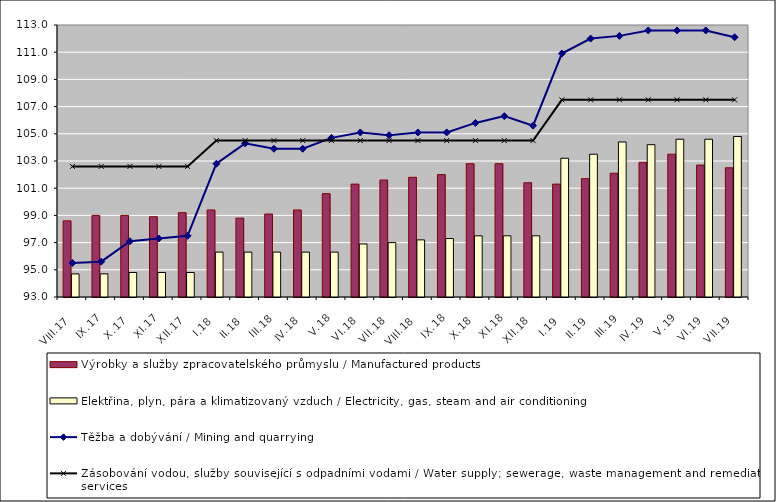
| Category | Výrobky a služby zpracovatelského průmyslu / Manufactured products | Elektřina, plyn, pára a klimatizovaný vzduch / Electricity, gas, steam and air conditioning |
|---|---|---|
| VIII.17 | 98.6 | 94.7 |
| IX.17 | 99 | 94.7 |
| X.17 | 99 | 94.8 |
| XI.17 | 98.9 | 94.8 |
| XII.17 | 99.2 | 94.8 |
| I.18 | 99.4 | 96.3 |
| II.18 | 98.8 | 96.3 |
| III.18 | 99.1 | 96.3 |
| IV.18 | 99.4 | 96.3 |
| V.18 | 100.6 | 96.3 |
| VI.18 | 101.3 | 96.9 |
| VII.18 | 101.6 | 97 |
| VIII.18 | 101.8 | 97.2 |
| IX.18 | 102 | 97.3 |
| X.18 | 102.8 | 97.5 |
| XI.18 | 102.8 | 97.5 |
| XII.18 | 101.4 | 97.5 |
| I.19 | 101.3 | 103.2 |
| II.19 | 101.7 | 103.5 |
| III.19 | 102.1 | 104.4 |
| IV.19 | 102.9 | 104.2 |
| V.19 | 103.5 | 104.6 |
| VI.19 | 102.7 | 104.6 |
| VII.19 | 102.5 | 104.8 |